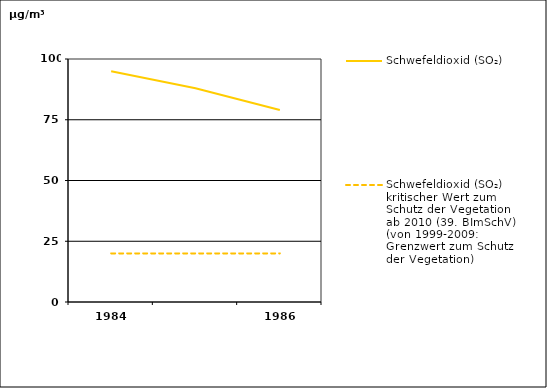
| Category | Schwefeldioxid (SO₂) | Schwefeldioxid (SO₂) kritischer Wert zum Schutz der Vegetation ab 2010 (39. BImSchV) (von 1999-2009: Grenzwert zum Schutz der Vegetation) |
|---|---|---|
| 1984.0 | 95 | 20 |
| 1985.0 | 88 | 20 |
| 1986.0 | 79 | 20 |